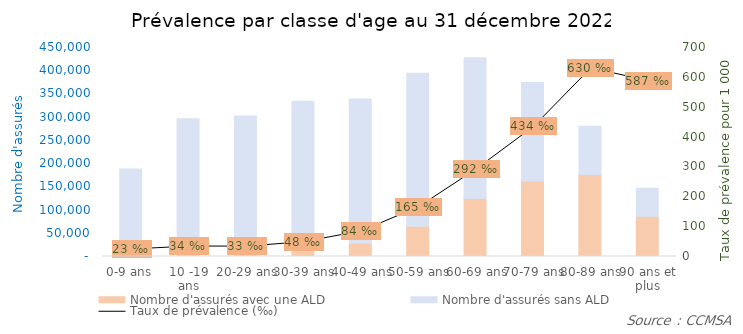
| Category | Nombre d'assurés avec une ALD | Nombre d'assurés sans ALD |
|---|---|---|
| 0-9 ans | 4409 | 184092 |
| 10 -19 ans | 9944 | 286571 |
| 20-29 ans | 9971 | 292359 |
| 30-39 ans | 16136 | 318035 |
| 40-49 ans | 28584 | 310754 |
| 50-59 ans | 65224 | 329416 |
| 60-69 ans | 124784 | 303034 |
| 70-79 ans | 162514 | 211939 |
| 80-89 ans | 176666 | 103557 |
| 90 ans et plus | 86304 | 60714 |